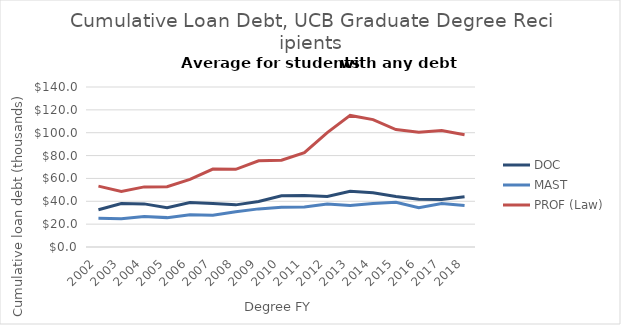
| Category | DOC | MAST | PROF (Law) |
|---|---|---|---|
| 2002.0 | 32607.944 | 25214.114 | 53255.438 |
| 2003.0 | 38028.675 | 24732.403 | 48687.523 |
| 2004.0 | 37718.626 | 26666.094 | 52604.898 |
| 2005.0 | 34368.296 | 25706.905 | 52788.574 |
| 2006.0 | 38874.25 | 28205.822 | 59130.46 |
| 2007.0 | 37984 | 27765.104 | 68143.745 |
| 2008.0 | 36866.398 | 30901.844 | 67988.635 |
| 2009.0 | 39799.05 | 33355.714 | 75386.509 |
| 2010.0 | 44817.78 | 34730.949 | 75919.848 |
| 2011.0 | 45162.477 | 34953.047 | 82541.935 |
| 2012.0 | 44127.932 | 37713.221 | 100053.292 |
| 2013.0 | 48729.025 | 36372.413 | 115128.214 |
| 2014.0 | 47539.563 | 38046.006 | 111489.942 |
| 2015.0 | 44255.432 | 39162.454 | 102778.789 |
| 2016.0 | 41859.21 | 34378.017 | 100379.479 |
| 2017.0 | 41581.64 | 38136.069 | 101878.786 |
| 2018.0 | 43993.638 | 36304.401 | 98168.338 |